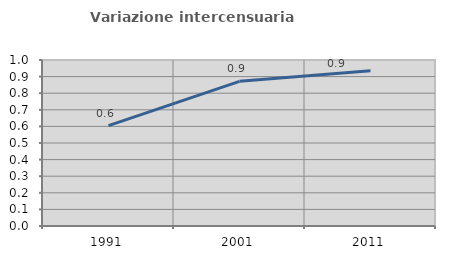
| Category | Variazione intercensuaria annua |
|---|---|
| 1991.0 | 0.604 |
| 2001.0 | 0.871 |
| 2011.0 | 0.935 |